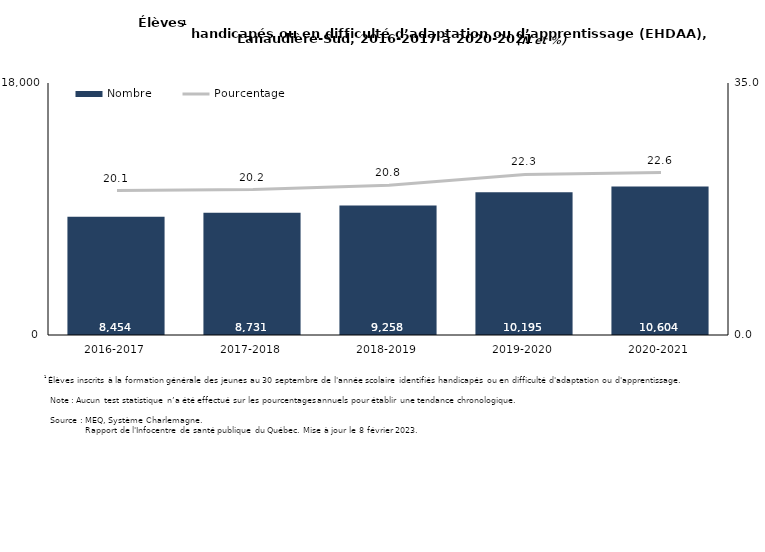
| Category | Nombre |
|---|---|
| 2016-2017 | 8454 |
| 2017-2018 | 8731 |
| 2018-2019 | 9258 |
| 2019-2020 | 10195 |
| 2020-2021 | 10604 |